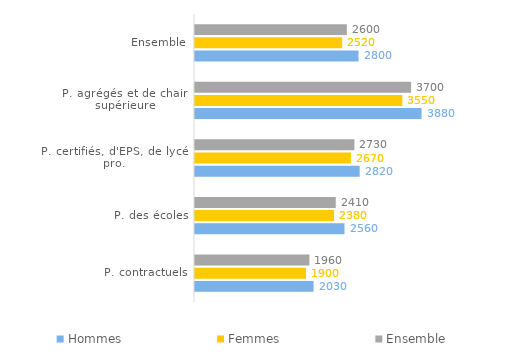
| Category | Hommes | Femmes | Ensemble |
|---|---|---|---|
| P. contractuels | 2030 | 1900 | 1960 |
| P. des écoles | 2560 | 2380 | 2410 |
| P. certifiés, d'EPS, de lycée pro. | 2820 | 2670 | 2730 |
| P. agrégés et de chaire supérieure | 3880 | 3550 | 3700 |
| Ensemble | 2800 | 2520 | 2600 |